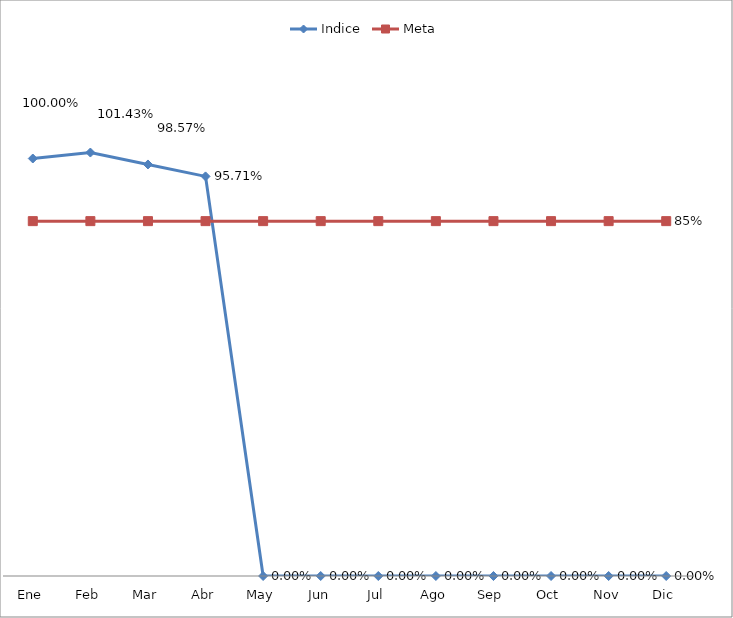
| Category | Indice | Meta |
|---|---|---|
| Ene | 1 | 0.85 |
| Feb | 1.014 | 0.85 |
| Mar | 0.986 | 0.85 |
| Abr | 0.957 | 0.85 |
| May | 0 | 0.85 |
| Jun | 0 | 0.85 |
| Jul | 0 | 0.85 |
| Ago | 0 | 0.85 |
| Sep | 0 | 0.85 |
| Oct | 0 | 0.85 |
| Nov | 0 | 0.85 |
| Dic | 0 | 0.85 |